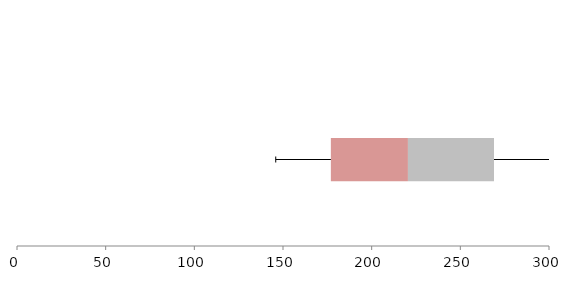
| Category | Series 1 | Series 2 | Series 3 |
|---|---|---|---|
| 0 | 176.992 | 43.458 | 48.533 |